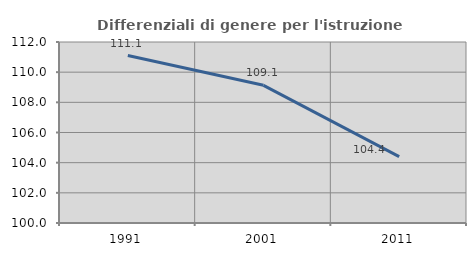
| Category | Differenziali di genere per l'istruzione superiore |
|---|---|
| 1991.0 | 111.101 |
| 2001.0 | 109.128 |
| 2011.0 | 104.397 |